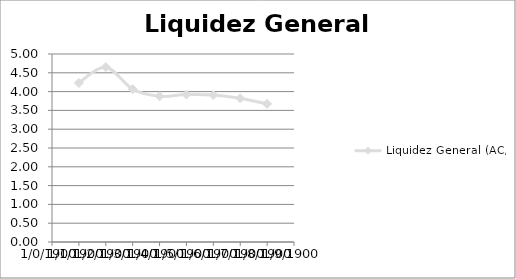
| Category | Liquidez General (AC/PC) |
|---|---|
| 0 | 4.231 |
| 1 | 4.65 |
| 2 | 4.064 |
| 3 | 3.877 |
| 4 | 3.922 |
| 5 | 3.911 |
| 6 | 3.821 |
| 7 | 3.673 |